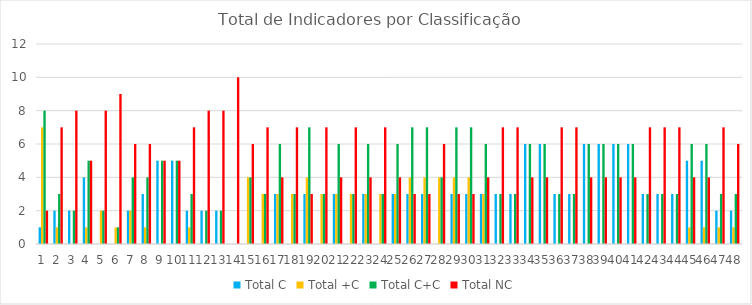
| Category | Total C | Total +C | Total C+C | Total NC |
|---|---|---|---|---|
| 0 | 1 | 7 | 8 | 2 |
| 1 | 2 | 1 | 3 | 7 |
| 2 | 2 | 0 | 2 | 8 |
| 3 | 4 | 1 | 5 | 5 |
| 4 | 0 | 2 | 2 | 8 |
| 5 | 0 | 1 | 1 | 9 |
| 6 | 2 | 2 | 4 | 6 |
| 7 | 3 | 1 | 4 | 6 |
| 8 | 5 | 0 | 5 | 5 |
| 9 | 5 | 0 | 5 | 5 |
| 10 | 2 | 1 | 3 | 7 |
| 11 | 2 | 0 | 2 | 8 |
| 12 | 2 | 0 | 2 | 8 |
| 13 | 0 | 0 | 0 | 10 |
| 14 | 0 | 4 | 4 | 6 |
| 15 | 0 | 3 | 3 | 7 |
| 16 | 3 | 3 | 6 | 4 |
| 17 | 0 | 3 | 3 | 7 |
| 18 | 3 | 4 | 7 | 3 |
| 19 | 0 | 3 | 3 | 7 |
| 20 | 3 | 3 | 6 | 4 |
| 21 | 0 | 3 | 3 | 7 |
| 22 | 3 | 3 | 6 | 4 |
| 23 | 0 | 3 | 3 | 7 |
| 24 | 3 | 3 | 6 | 4 |
| 25 | 3 | 4 | 7 | 3 |
| 26 | 3 | 4 | 7 | 3 |
| 27 | 0 | 4 | 4 | 6 |
| 28 | 3 | 4 | 7 | 3 |
| 29 | 3 | 4 | 7 | 3 |
| 30 | 3 | 3 | 6 | 4 |
| 31 | 3 | 0 | 3 | 7 |
| 32 | 3 | 0 | 3 | 7 |
| 33 | 6 | 0 | 6 | 4 |
| 34 | 6 | 0 | 6 | 4 |
| 35 | 3 | 0 | 3 | 7 |
| 36 | 3 | 0 | 3 | 7 |
| 37 | 6 | 0 | 6 | 4 |
| 38 | 6 | 0 | 6 | 4 |
| 39 | 6 | 0 | 6 | 4 |
| 40 | 6 | 0 | 6 | 4 |
| 41 | 3 | 0 | 3 | 7 |
| 42 | 3 | 0 | 3 | 7 |
| 43 | 3 | 0 | 3 | 7 |
| 44 | 5 | 1 | 6 | 4 |
| 45 | 5 | 1 | 6 | 4 |
| 46 | 2 | 1 | 3 | 7 |
| 47 | 2 | 1 | 3 | 6 |